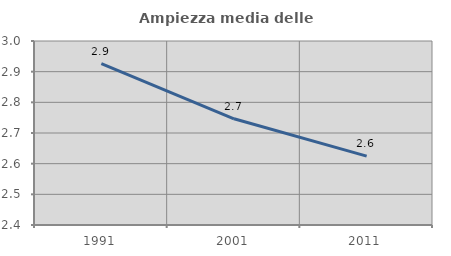
| Category | Ampiezza media delle famiglie |
|---|---|
| 1991.0 | 2.926 |
| 2001.0 | 2.746 |
| 2011.0 | 2.625 |